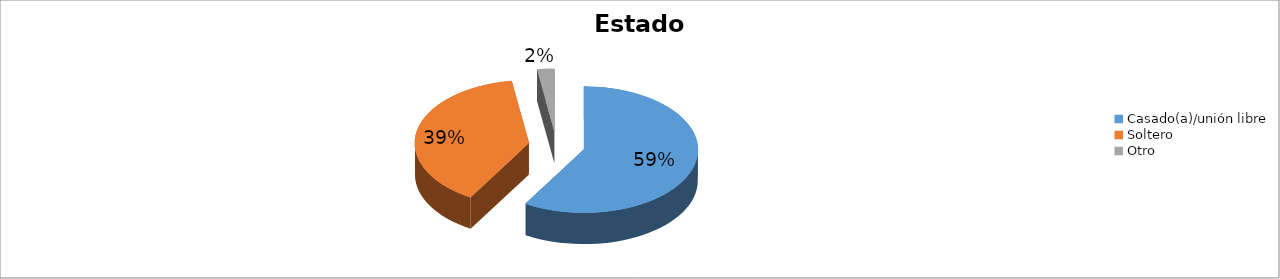
| Category | Series 0 |
|---|---|
| Casado(a)/unión libre | 0.585 |
| Soltero | 0.39 |
| Otro | 0.024 |